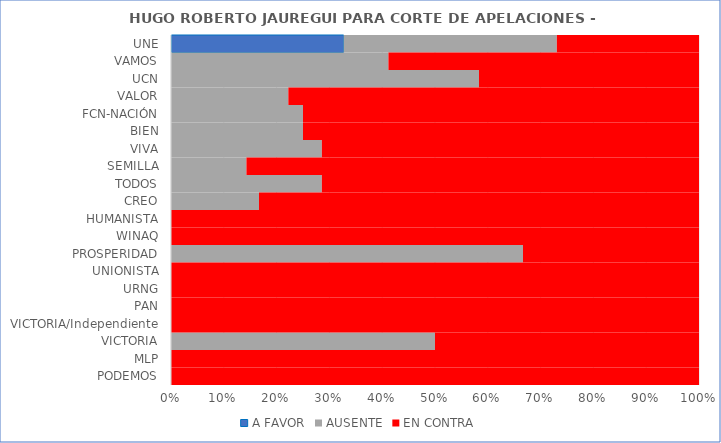
| Category | A FAVOR | AUSENTE | EN CONTRA |
|---|---|---|---|
| UNE | 0.327 | 0.404 | 0.269 |
| VAMOS | 0 | 0.412 | 0.588 |
| UCN | 0 | 0.583 | 0.417 |
| VALOR | 0 | 0.222 | 0.778 |
| FCN-NACIÓN | 0 | 0.25 | 0.75 |
| BIEN | 0 | 0.25 | 0.75 |
| VIVA | 0 | 0.286 | 0.714 |
| SEMILLA | 0 | 0.143 | 0.857 |
| TODOS | 0 | 0.286 | 0.714 |
| CREO | 0 | 0.167 | 0.833 |
| HUMANISTA | 0 | 0 | 1 |
| WINAQ | 0 | 0 | 1 |
| PROSPERIDAD | 0 | 0.667 | 0.333 |
| UNIONISTA | 0 | 0 | 1 |
| URNG | 0 | 0 | 1 |
| PAN | 0 | 0 | 1 |
| VICTORIA/Independiente | 0 | 0 | 1 |
| VICTORIA | 0 | 0.5 | 0.5 |
| MLP | 0 | 0 | 1 |
| PODEMOS | 0 | 0 | 1 |